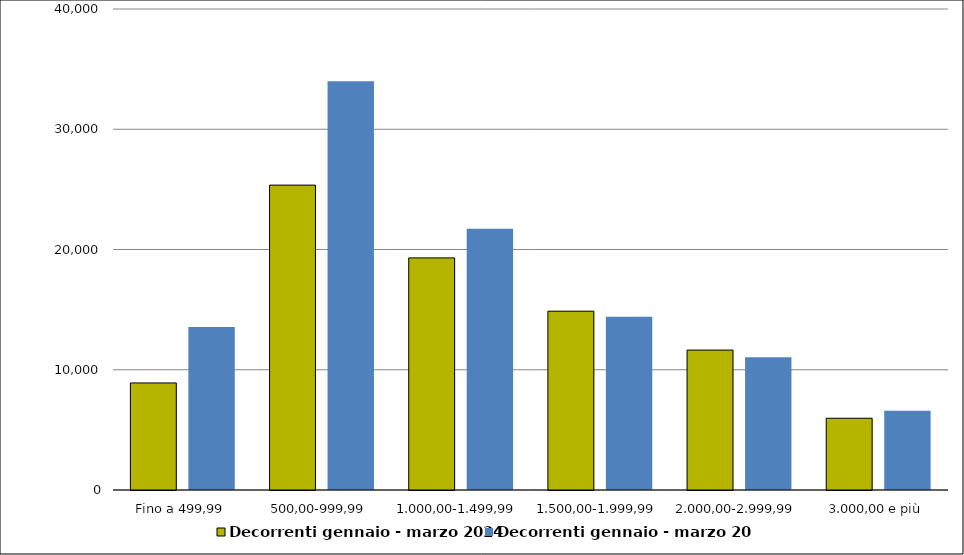
| Category | Decorrenti gennaio - marzo 2024 | Decorrenti gennaio - marzo 2023 |
|---|---|---|
|  Fino a 499,99  | 8902 | 13551 |
|  500,00-999,99  | 25354 | 33987 |
|  1.000,00-1.499,99  | 19303 | 21732 |
|  1.500,00-1.999,99  | 14869 | 14410 |
|  2.000,00-2.999,99  | 11636 | 11034 |
|  3.000,00 e più  | 5967 | 6591 |